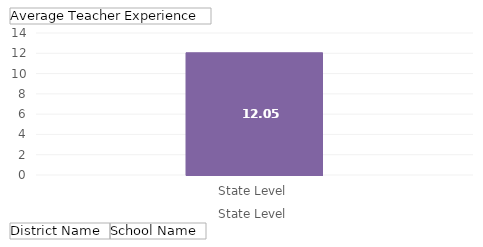
| Category | Total |
|---|---|
| 0 | 12.05 |